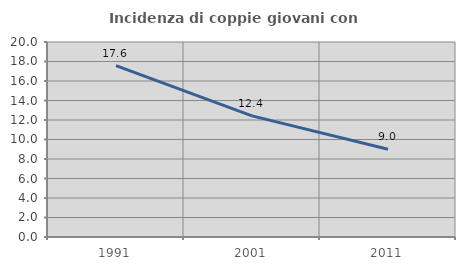
| Category | Incidenza di coppie giovani con figli |
|---|---|
| 1991.0 | 17.573 |
| 2001.0 | 12.424 |
| 2011.0 | 9.004 |